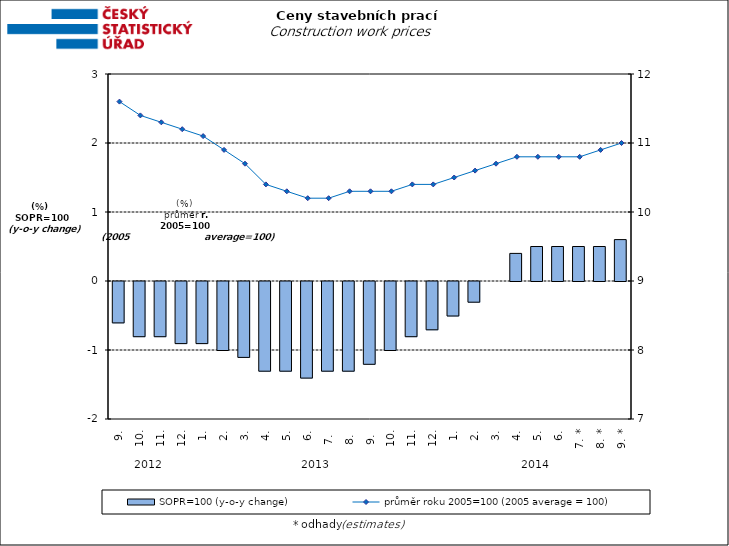
| Category | SOPR=100 (y-o-y change)   |
|---|---|
| 0 | -0.6 |
| 1 | -0.8 |
| 2 | -0.8 |
| 3 | -0.9 |
| 4 | -0.9 |
| 5 | -1 |
| 6 | -1.1 |
| 7 | -1.3 |
| 8 | -1.3 |
| 9 | -1.4 |
| 10 | -1.3 |
| 11 | -1.3 |
| 12 | -1.2 |
| 13 | -1 |
| 14 | -0.8 |
| 15 | -0.7 |
| 16 | -0.5 |
| 17 | -0.3 |
| 18 | 0 |
| 19 | 0.4 |
| 20 | 0.5 |
| 21 | 0.5 |
| 22 | 0.5 |
| 23 | 0.5 |
| 24 | 0.6 |